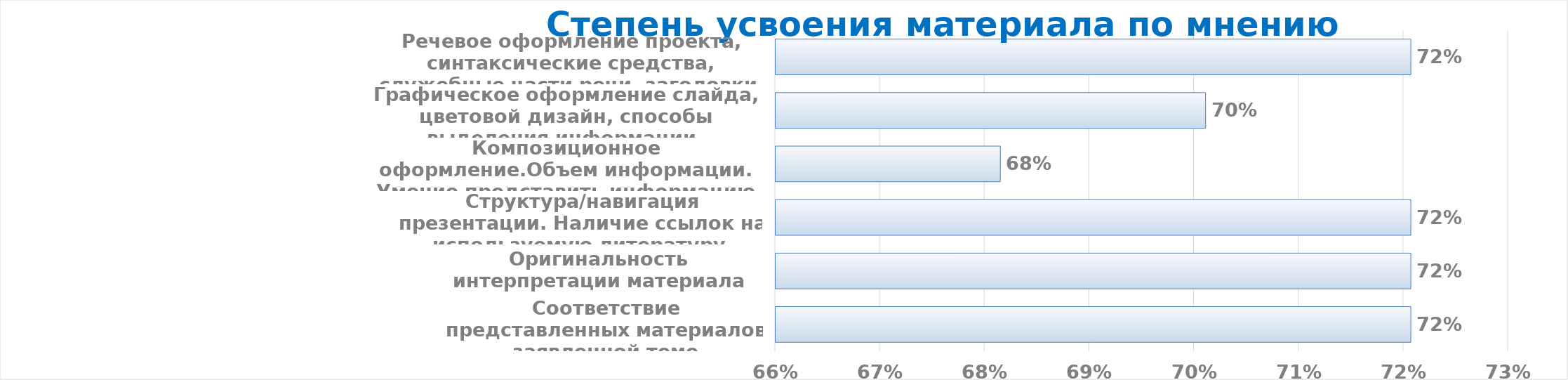
| Category | Series 0 |
|---|---|
| Соответствие представленных материалов заявленной теме | 0.716 |
| Оригинальность интерпретации материала | 0.716 |
| Структура/навигация презентации. Наличие ссылок на используемую литературу. | 0.716 |
| Композиционное оформление.Объем информации. Умение представить информацию разных видов (текстовый материал, картинки, графики, схемы). | 0.676 |
| Графическое оформление слайда, цветовой дизайн, способы выделения информации, анимационные эффекты, шрифты | 0.696 |
| Речевое оформление проекта, синтаксические средства, служебные части речи, заголовки. | 0.716 |